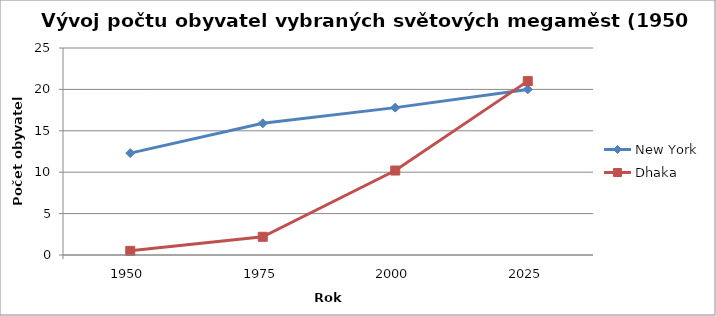
| Category | New York | Dhaka |
|---|---|---|
| 1950.0 | 12.3 | 0.5 |
| 1975.0 | 15.9 | 2.2 |
| 2000.0 | 17.8 | 10.2 |
| 2025.0 | 20 | 21 |